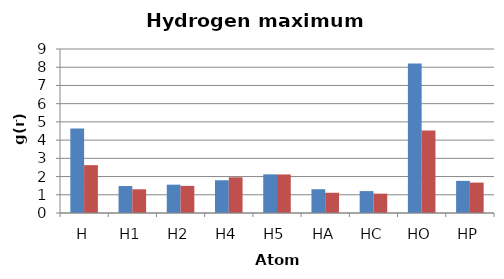
| Category | OW | HW |
|---|---|---|
| H | 4.635 | 2.627 |
| H1 | 1.479 | 1.301 |
| H2 | 1.555 | 1.487 |
| H4 | 1.797 | 1.958 |
| H5 | 2.121 | 2.114 |
| HA | 1.304 | 1.11 |
| HC | 1.202 | 1.062 |
| HO | 8.206 | 4.529 |
| HP | 1.762 | 1.667 |